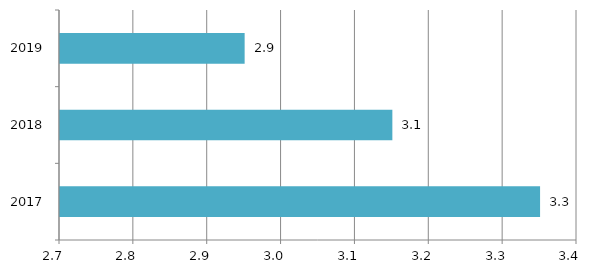
| Category | Series 0 |
|---|---|
| 2017.0 | 3.3 |
| 2018.0 | 3.1 |
| 2019.0 | 2.9 |